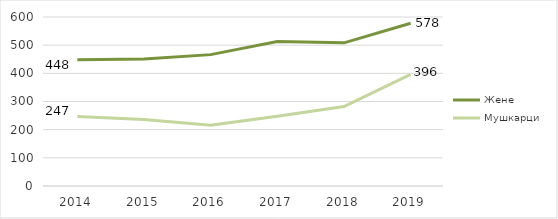
| Category | Жене | Мушкарци |
|---|---|---|
| 2014.0 | 447.917 | 246.75 |
| 2015.0 | 451.25 | 235.75 |
| 2016.0 | 466.417 | 215.5 |
| 2017.0 | 512.833 | 248 |
| 2018.0 | 508.333 | 282.25 |
| 2019.0 | 577.75 | 396.083 |